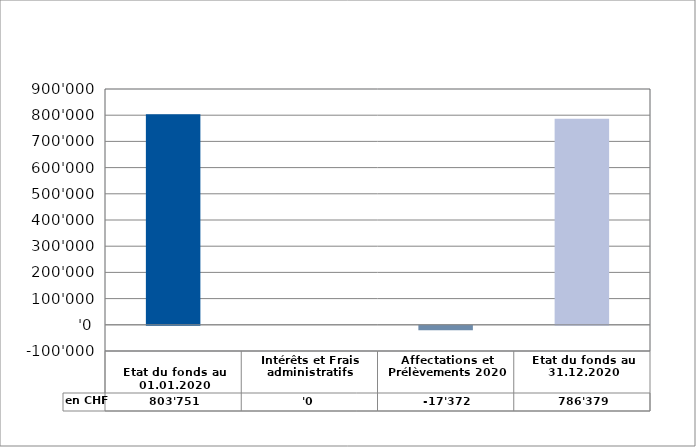
| Category | en CHF |
|---|---|
| 
Etat du fonds au 01.01.2020

 | 803751 |
| Intérêts et Frais administratifs | 0 |
| Affectations et Prélèvements 2020 | -17372.07 |
| Etat du fonds au 31.12.2020 | 786378.93 |